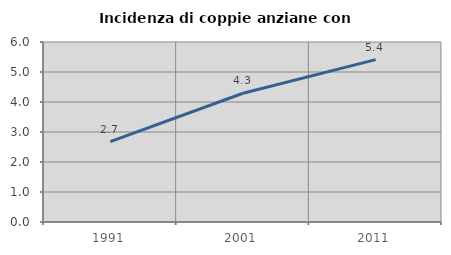
| Category | Incidenza di coppie anziane con figli |
|---|---|
| 1991.0 | 2.68 |
| 2001.0 | 4.291 |
| 2011.0 | 5.412 |